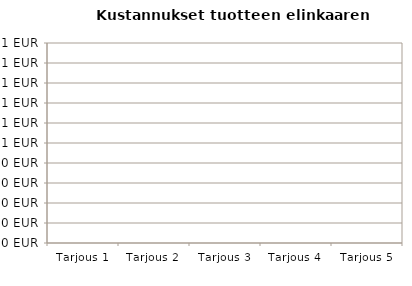
| Category | HANKINTAKUSTANNUS KAPPALETTA KOHDEN | MUUT KULUT YHTEENSÄ KAPPALETTA KOHDEN, NYKYARVO |
|---|---|---|
| Tarjous 1 | 0 | 0 |
| Tarjous 2 | 0 | 0 |
| Tarjous 3 | 0 | 0 |
| Tarjous 4 | 0 | 0 |
| Tarjous 5 | 0 | 0 |